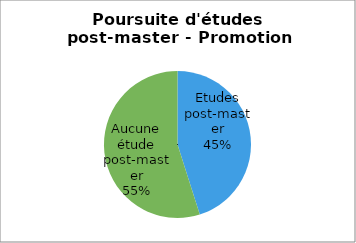
| Category | Promotion 2008 |
|---|---|
| Etudes post-master | 0.451 |
| Aucune étude post-master | 0.549 |